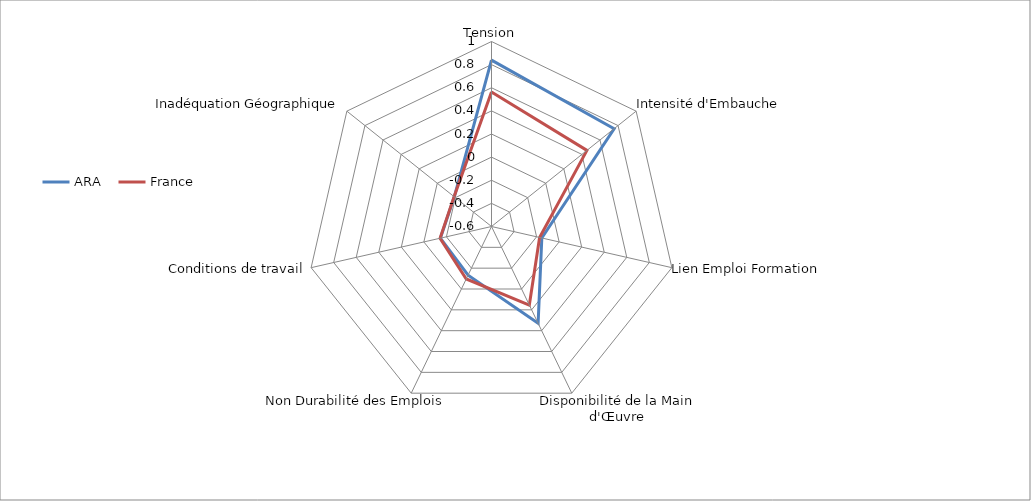
| Category | ARA | France |
|---|---|---|
| Tension | 0.838 | 0.564 |
| Intensité d'Embauche | 0.756 | 0.456 |
| Lien Emploi Formation | -0.154 | -0.173 |
| Disponibilité de la Main d'Œuvre | 0.329 | 0.154 |
| Non Durabilité des Emplois | -0.133 | -0.097 |
| Conditions de travail | -0.146 | -0.144 |
| Inadéquation Géographique | -0.188 | -0.186 |